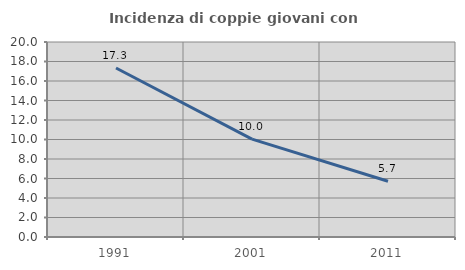
| Category | Incidenza di coppie giovani con figli |
|---|---|
| 1991.0 | 17.333 |
| 2001.0 | 10.041 |
| 2011.0 | 5.717 |